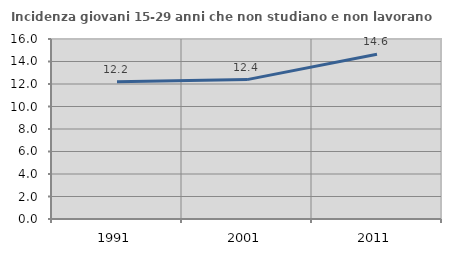
| Category | Incidenza giovani 15-29 anni che non studiano e non lavorano  |
|---|---|
| 1991.0 | 12.189 |
| 2001.0 | 12.39 |
| 2011.0 | 14.64 |